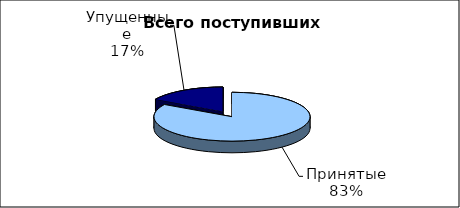
| Category | Series 0 |
|---|---|
| Принятые | 1500 |
| Упущенные | 300 |